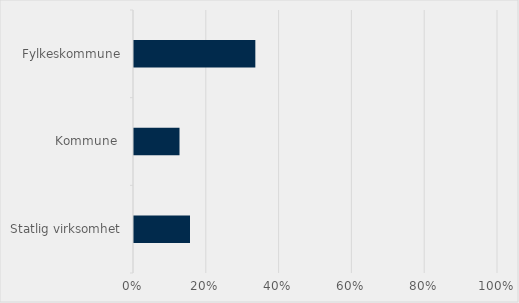
| Category | Series 0 |
|---|---|
| Statlig virksomhet | 0.154 |
| Kommune  | 0.125 |
| Fylkeskommune | 0.333 |